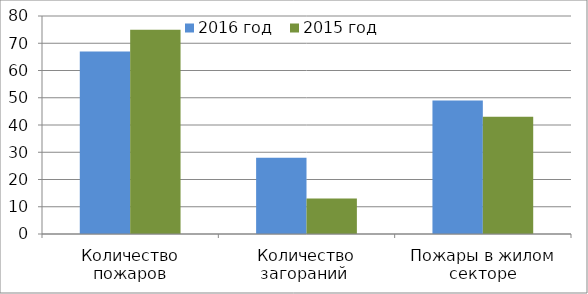
| Category | 2016 год | 2015 год |
|---|---|---|
| Количество пожаров | 67 | 75 |
| Количество загораний  | 28 | 13 |
| Пожары в жилом секторе | 49 | 43 |